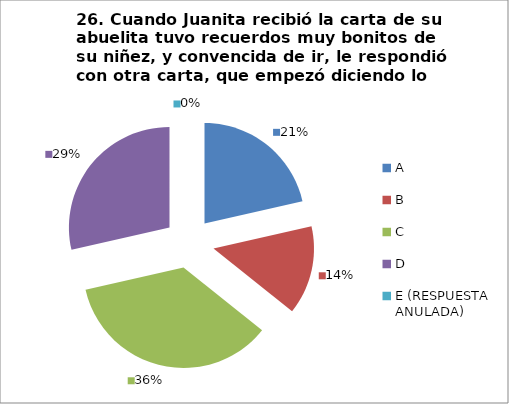
| Category | CANTIDAD DE RESPUESTAS PREGUNTA (23) | PORCENTAJE |
|---|---|---|
| A | 6 | 0.214 |
| B | 4 | 0.143 |
| C | 10 | 0.357 |
| D | 8 | 0.286 |
| E (RESPUESTA ANULADA) | 0 | 0 |